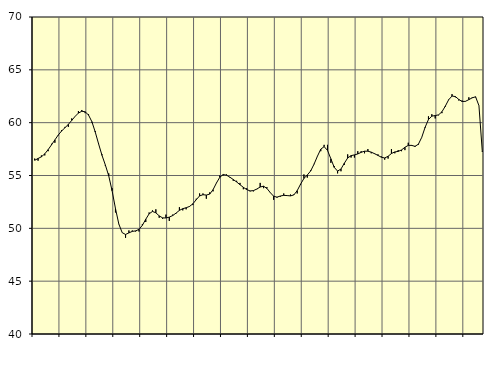
| Category | Piggar | Samtliga fast anställda (inkl. fast anställda utomlands) |
|---|---|---|
| nan | 56.6 | 56.44 |
| 87.0 | 56.4 | 56.61 |
| 87.0 | 56.9 | 56.77 |
| 87.0 | 56.9 | 57.05 |
| nan | 57.3 | 57.45 |
| 88.0 | 58 | 57.9 |
| 88.0 | 58.1 | 58.37 |
| 88.0 | 58.8 | 58.83 |
| nan | 59.3 | 59.21 |
| 89.0 | 59.6 | 59.52 |
| 89.0 | 59.6 | 59.84 |
| 89.0 | 60.4 | 60.21 |
| nan | 60.6 | 60.59 |
| 90.0 | 61.1 | 60.91 |
| 90.0 | 61.2 | 61.08 |
| 90.0 | 60.9 | 61.03 |
| nan | 60.8 | 60.72 |
| 91.0 | 60 | 60.09 |
| 91.0 | 59.2 | 59.11 |
| 91.0 | 58 | 57.98 |
| nan | 57 | 56.91 |
| 92.0 | 55.9 | 55.99 |
| 92.0 | 55.2 | 54.97 |
| 92.0 | 53.8 | 53.56 |
| nan | 51.5 | 51.88 |
| 93.0 | 50.4 | 50.41 |
| 93.0 | 49.6 | 49.59 |
| 93.0 | 49.1 | 49.42 |
| nan | 49.8 | 49.57 |
| 94.0 | 49.8 | 49.71 |
| 94.0 | 49.7 | 49.76 |
| 94.0 | 49.7 | 49.9 |
| nan | 50.4 | 50.29 |
| 95.0 | 50.6 | 50.86 |
| 95.0 | 51.5 | 51.37 |
| 95.0 | 51.7 | 51.6 |
| nan | 51.8 | 51.47 |
| 96.0 | 51 | 51.18 |
| 96.0 | 50.9 | 50.99 |
| 96.0 | 51.3 | 50.98 |
| nan | 50.7 | 51.06 |
| 97.0 | 51.3 | 51.21 |
| 97.0 | 51.4 | 51.44 |
| 97.0 | 52 | 51.7 |
| nan | 51.7 | 51.86 |
| 98.0 | 51.8 | 51.95 |
| 98.0 | 52.1 | 52.07 |
| 98.0 | 52.2 | 52.32 |
| nan | 52.8 | 52.71 |
| 99.0 | 53.3 | 53.07 |
| 99.0 | 53.3 | 53.18 |
| 99.0 | 52.8 | 53.15 |
| nan | 53.4 | 53.24 |
| 0.0 | 53.5 | 53.66 |
| 0.0 | 54.3 | 54.29 |
| 0.0 | 55 | 54.83 |
| nan | 55 | 55.09 |
| 1.0 | 55.1 | 55.03 |
| 1.0 | 54.8 | 54.84 |
| 1.0 | 54.5 | 54.62 |
| nan | 54.5 | 54.39 |
| 2.0 | 54.3 | 54.13 |
| 2.0 | 53.7 | 53.88 |
| 2.0 | 53.8 | 53.67 |
| nan | 53.5 | 53.54 |
| 3.0 | 53.5 | 53.57 |
| 3.0 | 53.7 | 53.72 |
| 3.0 | 54.3 | 53.91 |
| nan | 53.8 | 53.99 |
| 4.0 | 53.9 | 53.78 |
| 4.0 | 53.4 | 53.38 |
| 4.0 | 52.7 | 53.04 |
| nan | 52.9 | 52.95 |
| 5.0 | 53 | 53.06 |
| 5.0 | 53.3 | 53.12 |
| 5.0 | 53.1 | 53.1 |
| nan | 53.2 | 53.07 |
| 6.0 | 53.2 | 53.16 |
| 6.0 | 53.3 | 53.57 |
| 6.0 | 54.1 | 54.18 |
| nan | 55.1 | 54.72 |
| 7.0 | 54.8 | 55.05 |
| 7.0 | 55.5 | 55.43 |
| 7.0 | 56.1 | 56.07 |
| nan | 56.8 | 56.82 |
| 8.0 | 57.3 | 57.49 |
| 8.0 | 57.9 | 57.73 |
| 8.0 | 57.9 | 57.38 |
| nan | 56.2 | 56.58 |
| 9.0 | 55.9 | 55.77 |
| 9.0 | 55.2 | 55.42 |
| 9.0 | 55.4 | 55.61 |
| nan | 56 | 56.16 |
| 10.0 | 57 | 56.66 |
| 10.0 | 56.7 | 56.88 |
| 10.0 | 56.7 | 56.95 |
| nan | 57.3 | 57.04 |
| 11.0 | 57.3 | 57.19 |
| 11.0 | 57.1 | 57.3 |
| 11.0 | 57.5 | 57.3 |
| nan | 57.1 | 57.21 |
| 12.0 | 57.1 | 57.06 |
| 12.0 | 57 | 56.9 |
| 12.0 | 56.8 | 56.73 |
| nan | 56.5 | 56.66 |
| 13.0 | 56.6 | 56.82 |
| 13.0 | 57.5 | 57.08 |
| 13.0 | 57.1 | 57.23 |
| nan | 57.4 | 57.28 |
| 14.0 | 57.3 | 57.42 |
| 14.0 | 57.4 | 57.67 |
| 14.0 | 58.1 | 57.85 |
| nan | 57.8 | 57.85 |
| 15.0 | 57.7 | 57.76 |
| 15.0 | 57.9 | 57.96 |
| 15.0 | 58.6 | 58.61 |
| nan | 59.5 | 59.56 |
| 16.0 | 60.6 | 60.3 |
| 16.0 | 60.8 | 60.62 |
| 16.0 | 60.4 | 60.67 |
| nan | 60.7 | 60.74 |
| 17.0 | 60.9 | 61.03 |
| 17.0 | 61.5 | 61.56 |
| 17.0 | 62.2 | 62.17 |
| nan | 62.7 | 62.52 |
| 18.0 | 62.4 | 62.47 |
| 18.0 | 62.1 | 62.2 |
| 18.0 | 62.1 | 62 |
| nan | 62 | 62.02 |
| 19.0 | 62.4 | 62.18 |
| 19.0 | 62.4 | 62.35 |
| 19.0 | 62.4 | 62.45 |
| nan | 61.6 | 61.61 |
| 20.0 | 57.3 | 57.25 |